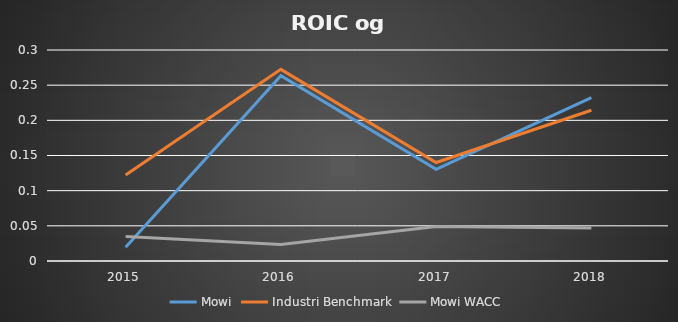
| Category | Mowi | Industri Benchmark | Mowi WACC |
|---|---|---|---|
| 2015.0 | 0.019 | 0.122 | 0.035 |
| 2016.0 | 0.263 | 0.272 | 0.023 |
| 2017.0 | 0.13 | 0.14 | 0.049 |
| 2018.0 | 0.232 | 0.214 | 0.047 |